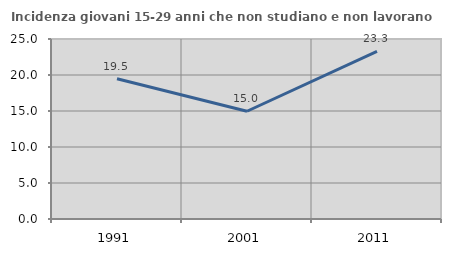
| Category | Incidenza giovani 15-29 anni che non studiano e non lavorano  |
|---|---|
| 1991.0 | 19.469 |
| 2001.0 | 14.966 |
| 2011.0 | 23.276 |